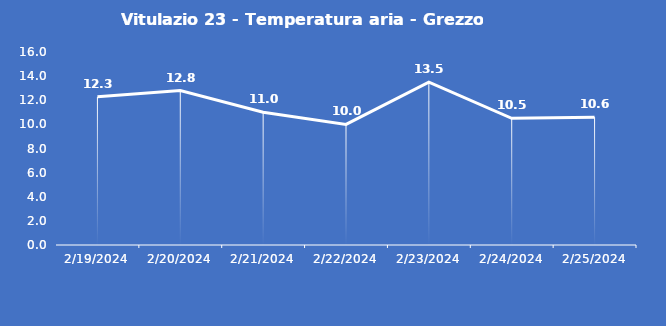
| Category | Vitulazio 23 - Temperatura aria - Grezzo (°C) |
|---|---|
| 2/19/24 | 12.3 |
| 2/20/24 | 12.8 |
| 2/21/24 | 11 |
| 2/22/24 | 10 |
| 2/23/24 | 13.5 |
| 2/24/24 | 10.5 |
| 2/25/24 | 10.6 |